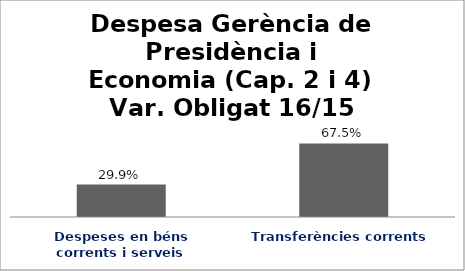
| Category | Series 0 |
|---|---|
| Despeses en béns corrents i serveis | 0.299 |
| Transferències corrents | 0.675 |